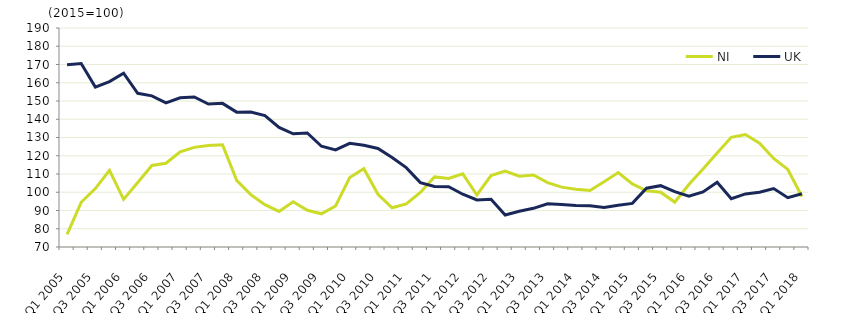
| Category | NI  | UK  |
|---|---|---|
| Q1 2005 | 76.9 | 169.9 |
|  | 94.5 | 170.5 |
| Q3 2005 | 102 | 157.6 |
|  | 112 | 160.6 |
| Q1 2006 | 96.1 | 165.2 |
|  | 105.3 | 154.2 |
| Q3 2006 | 114.7 | 152.8 |
|  | 115.9 | 149 |
| Q1 2007 | 122.1 | 151.8 |
|  | 124.6 | 152.2 |
| Q3 2007 | 125.6 | 148.3 |
|  | 126 | 148.7 |
| Q1 2008 | 106.5 | 143.9 |
|  | 98.7 | 144 |
| Q3 2008 | 93.2 | 142 |
|  | 89.5 | 135.5 |
| Q1 2009 | 94.8 | 132 |
|  | 90.1 | 132.5 |
| Q3 2009 | 88.2 | 125.2 |
|  | 92.5 | 123.2 |
| Q1 2010 | 108.1 | 126.8 |
|  | 112.9 | 125.7 |
| Q3 2010 | 98.9 | 124 |
|  | 91.5 | 119 |
| Q1 2011 | 93.6 | 113.5 |
|  | 99.9 | 105.3 |
| Q3 2011 | 108.4 | 103.2 |
|  | 107.6 | 103 |
| Q1 2012 | 110.1 | 98.9 |
|  | 98.5 | 95.8 |
| Q3 2012 | 109.1 | 96.2 |
|  | 111.6 | 87.5 |
| Q1 2013 | 108.8 | 89.6 |
|  | 109.5 | 91.2 |
| Q3 2013 | 105.3 | 93.7 |
|  | 102.8 | 93.3 |
| Q1 2014 | 101.7 | 92.7 |
|  | 101 | 92.6 |
| Q3 2014 | 105.8 | 91.6 |
|  | 110.8 | 92.9 |
| Q1 2015 | 104.6 | 93.9 |
|  | 100.8 | 102.2 |
| Q3 2015 | 100 | 103.6 |
|  | 94.6 | 100.3 |
| Q1 2016 | 104.2 | 97.8 |
|  | 112.8 | 100.2 |
| Q3 2016 | 121.5 | 105.5 |
|  | 130.1 | 96.5 |
| Q1 2017 | 131.6 | 99.1 |
|  | 126.9 | 100 |
| Q3 2017 | 118.5 | 102 |
|  | 112.5 | 97 |
| Q1 2018 | 97.7 | 99.2 |